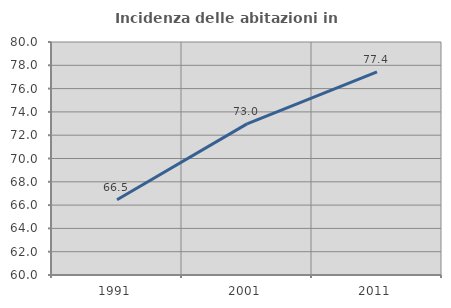
| Category | Incidenza delle abitazioni in proprietà  |
|---|---|
| 1991.0 | 66.453 |
| 2001.0 | 72.969 |
| 2011.0 | 77.436 |